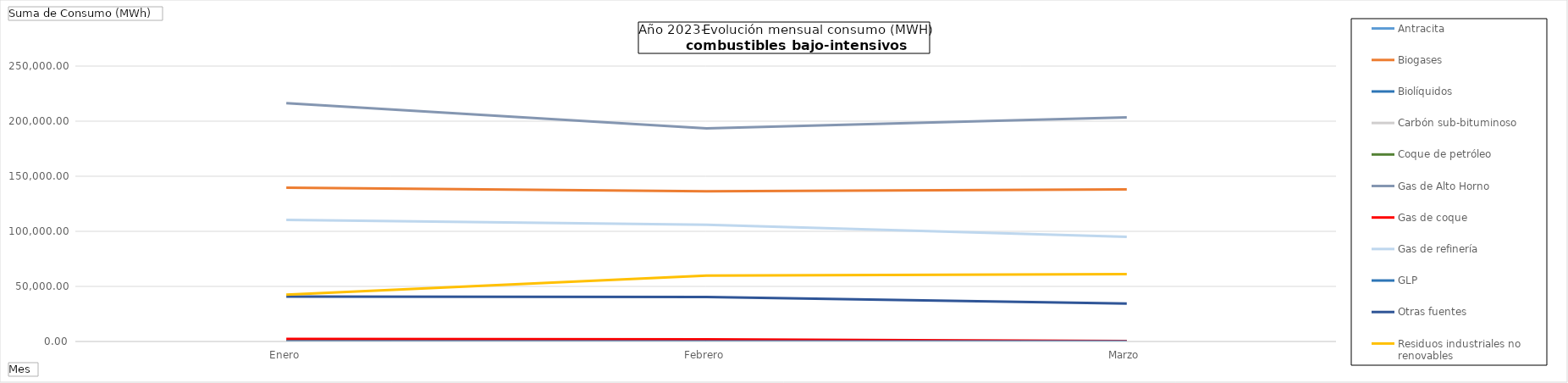
| Category | Antracita | Biogases | Biolíquidos | Carbón sub-bituminoso | Coque de petróleo | Gas de Alto Horno | Gas de coque | Gas de refinería | GLP | Otras fuentes | Residuos industriales no renovables |
|---|---|---|---|---|---|---|---|---|---|---|---|
| Enero | 0 | 139637.29 | 0 | 0 | 0 | 216401 | 2262.85 | 110398 | 0 | 40686.93 | 42539 |
| Febrero | 0 | 136283.28 | 0 | 0 | 0 | 193519 | 1988.79 | 105931 | 0 | 40333.85 | 59843 |
| Marzo | 0 | 137984.25 | 0 | 0 | 0 | 203423 | 323.84 | 95054 | 0.23 | 34409.38 | 61148 |